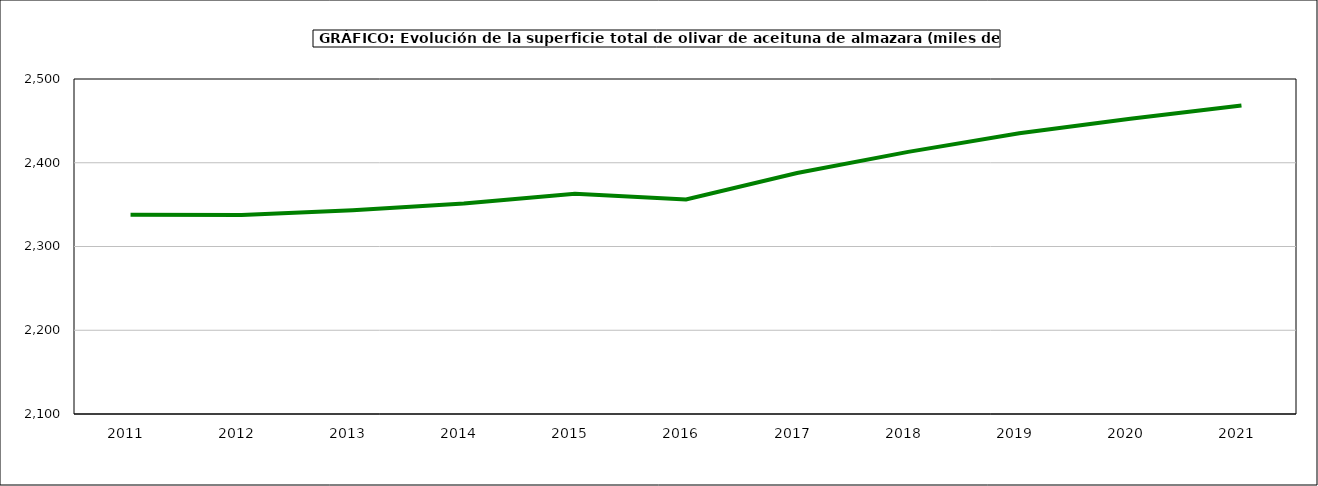
| Category | superficie |
|---|---|
| 2011.0 | 2337.913 |
| 2012.0 | 2337.582 |
| 2013.0 | 2343.184 |
| 2014.0 | 2351.428 |
| 2015.0 | 2363.082 |
| 2016.0 | 2356.047 |
| 2017.0 | 2387.832 |
| 2018.0 | 2413.021 |
| 2019.0 | 2435.127 |
| 2020.0 | 2452.569 |
| 2021.0 | 2468.464 |